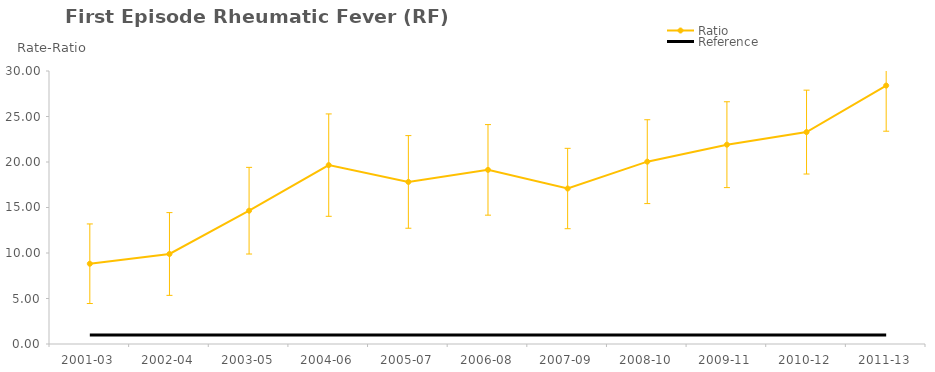
| Category | Ratio | Reference |
|---|---|---|
| 2001-03 | 8.821 | 1 |
| 2002-04 | 9.891 | 1 |
| 2003-05 | 14.648 | 1 |
| 2004-06 | 19.657 | 1 |
| 2005-07 | 17.81 | 1 |
| 2006-08 | 19.135 | 1 |
| 2007-09 | 17.086 | 1 |
| 2008-10 | 20.037 | 1 |
| 2009-11 | 21.903 | 1 |
| 2010-12 | 23.288 | 1 |
| 2011-13 | 28.398 | 1 |